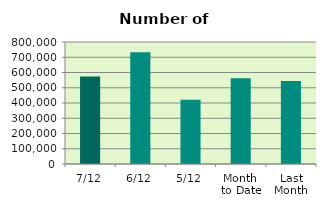
| Category | Series 0 |
|---|---|
| 7/12 | 574090 |
| 6/12 | 732774 |
| 5/12 | 421810 |
| Month 
to Date | 562758.4 |
| Last
Month | 544187.818 |